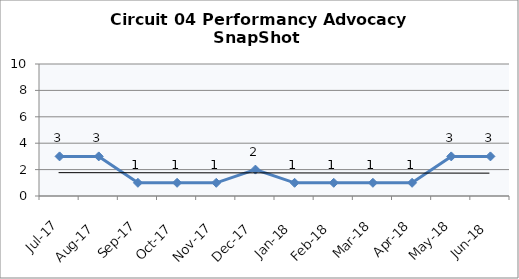
| Category | Circuit 04 |
|---|---|
| Jul-17 | 3 |
| Aug-17 | 3 |
| Sep-17 | 1 |
| Oct-17 | 1 |
| Nov-17 | 1 |
| Dec-17 | 2 |
| Jan-18 | 1 |
| Feb-18 | 1 |
| Mar-18 | 1 |
| Apr-18 | 1 |
| May-18 | 3 |
| Jun-18 | 3 |